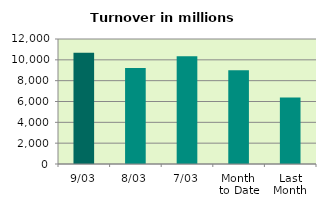
| Category | Series 0 |
|---|---|
| 9/03 | 10676.506 |
| 8/03 | 9217.078 |
| 7/03 | 10348.412 |
| Month 
to Date | 9005.253 |
| Last
Month | 6378.947 |